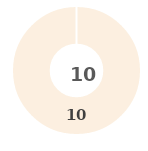
| Category | Series 0 |
|---|---|
| 0 | 0 |
| 1 | 0 |
| 2 | 0 |
| 3 | 0 |
| 4 | 10 |